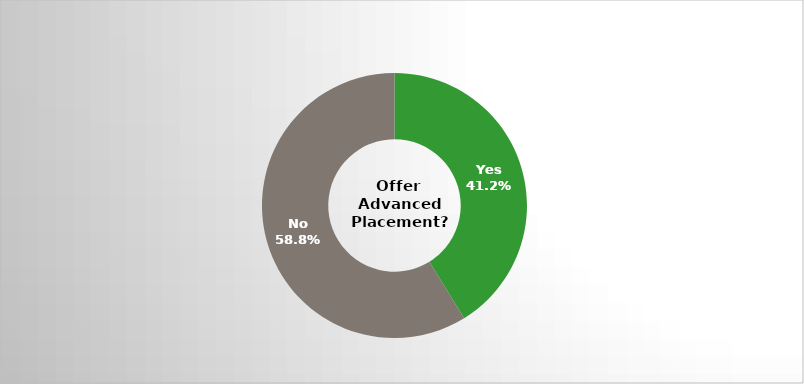
| Category | Series 0 |
|---|---|
| Yes | 0.412 |
| No | 0.588 |